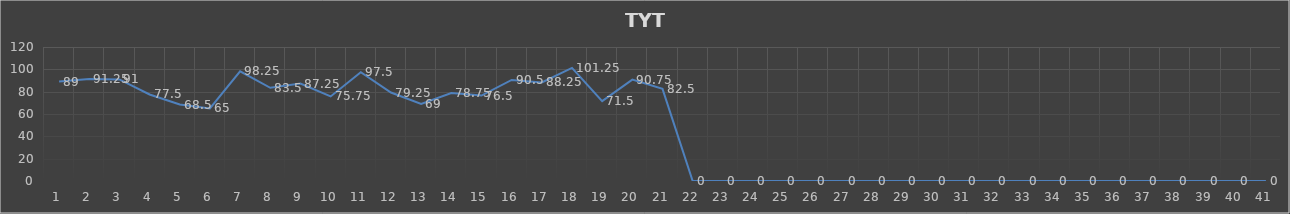
| Category | Series 0 |
|---|---|
| 0 | 89 |
| 1 | 91.25 |
| 2 | 91 |
| 3 | 77.5 |
| 4 | 68.5 |
| 5 | 65 |
| 6 | 98.25 |
| 7 | 83.5 |
| 8 | 87.25 |
| 9 | 75.75 |
| 10 | 97.5 |
| 11 | 79.25 |
| 12 | 69 |
| 13 | 78.75 |
| 14 | 76.5 |
| 15 | 90.5 |
| 16 | 88.25 |
| 17 | 101.25 |
| 18 | 71.5 |
| 19 | 90.75 |
| 20 | 82.5 |
| 21 | 0 |
| 22 | 0 |
| 23 | 0 |
| 24 | 0 |
| 25 | 0 |
| 26 | 0 |
| 27 | 0 |
| 28 | 0 |
| 29 | 0 |
| 30 | 0 |
| 31 | 0 |
| 32 | 0 |
| 33 | 0 |
| 34 | 0 |
| 35 | 0 |
| 36 | 0 |
| 37 | 0 |
| 38 | 0 |
| 39 | 0 |
| 40 | 0 |